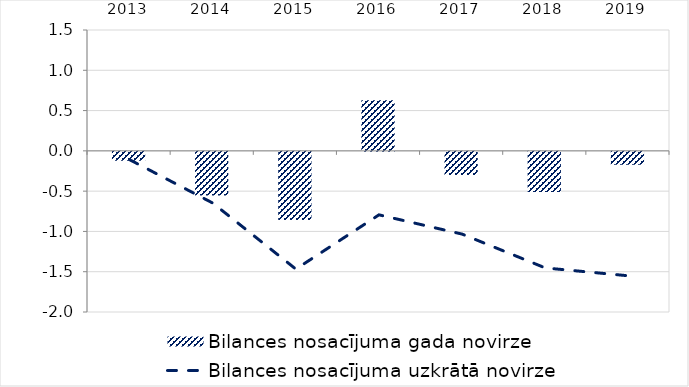
| Category | Bilances nosacījuma gada novirze |
|---|---|
| 2013.0 | -0.109 |
| 2014.0 | -0.542 |
| 2015.0 | -0.845 |
| 2016.0 | 0.627 |
| 2017.0 | -0.286 |
| 2018.0 | -0.497 |
| 2019.0 | -0.161 |